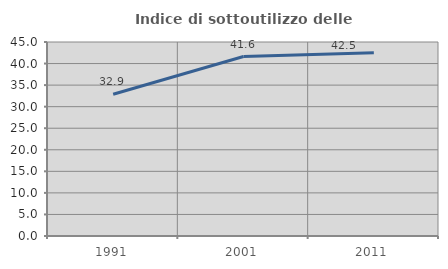
| Category | Indice di sottoutilizzo delle abitazioni  |
|---|---|
| 1991.0 | 32.871 |
| 2001.0 | 41.628 |
| 2011.0 | 42.518 |